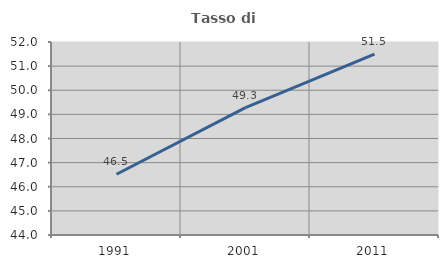
| Category | Tasso di occupazione   |
|---|---|
| 1991.0 | 46.517 |
| 2001.0 | 49.279 |
| 2011.0 | 51.5 |